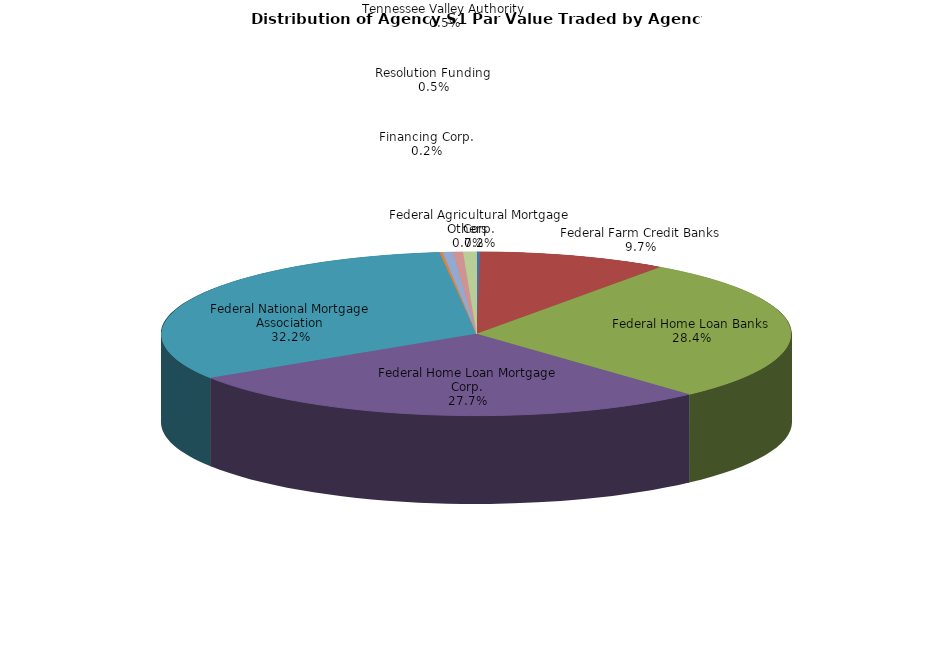
| Category | Series 0 |
|---|---|
| Federal Agricultural Mortgage Corp. | 20159489.044 |
| Federal Farm Credit Banks | 1035128827.998 |
| Federal Home Loan Banks | 3034919677.813 |
| Federal Home Loan Mortgage Corp. | 2966962832.351 |
| Federal National Mortgage Association | 3442305516.69 |
| Financing Corp. | 16420490.04 |
| Resolution Funding | 57875123.506 |
| Tennessee Valley Authority | 52735306.028 |
| Others | 73349210.383 |